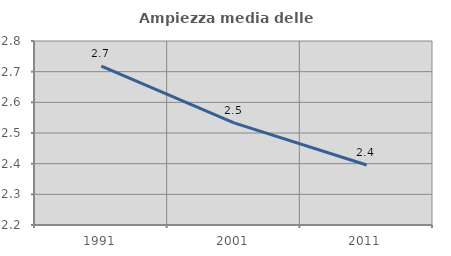
| Category | Ampiezza media delle famiglie |
|---|---|
| 1991.0 | 2.718 |
| 2001.0 | 2.533 |
| 2011.0 | 2.395 |